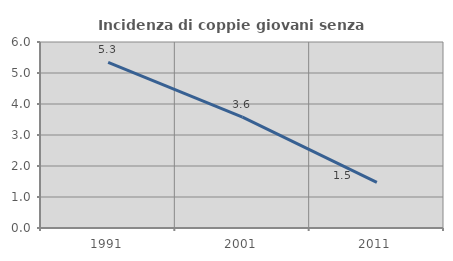
| Category | Incidenza di coppie giovani senza figli |
|---|---|
| 1991.0 | 5.34 |
| 2001.0 | 3.576 |
| 2011.0 | 1.472 |